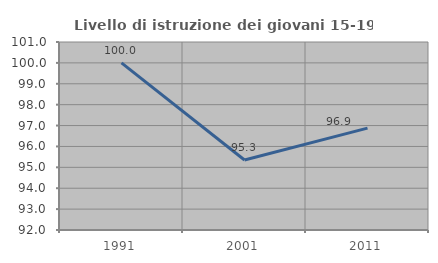
| Category | Livello di istruzione dei giovani 15-19 anni |
|---|---|
| 1991.0 | 100 |
| 2001.0 | 95.349 |
| 2011.0 | 96.875 |